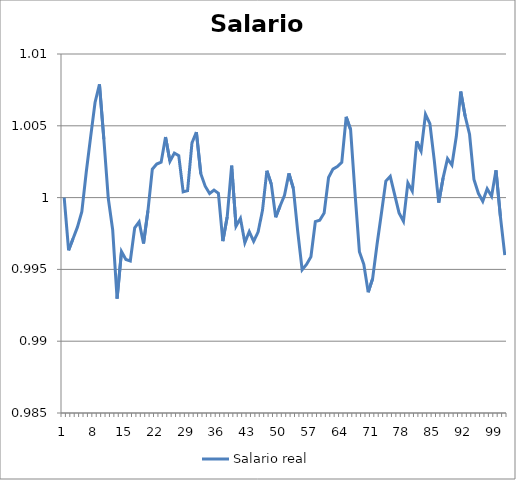
| Category | Salario real |
|---|---|
| 0 | 1 |
| 1 | 0.996 |
| 2 | 0.997 |
| 3 | 0.998 |
| 4 | 0.999 |
| 5 | 1.002 |
| 6 | 1.004 |
| 7 | 1.007 |
| 8 | 1.008 |
| 9 | 1.004 |
| 10 | 1 |
| 11 | 0.998 |
| 12 | 0.993 |
| 13 | 0.996 |
| 14 | 0.996 |
| 15 | 0.996 |
| 16 | 0.998 |
| 17 | 0.998 |
| 18 | 0.997 |
| 19 | 0.999 |
| 20 | 1.002 |
| 21 | 1.002 |
| 22 | 1.002 |
| 23 | 1.004 |
| 24 | 1.003 |
| 25 | 1.003 |
| 26 | 1.003 |
| 27 | 1 |
| 28 | 1 |
| 29 | 1.004 |
| 30 | 1.005 |
| 31 | 1.002 |
| 32 | 1.001 |
| 33 | 1 |
| 34 | 1.001 |
| 35 | 1 |
| 36 | 0.997 |
| 37 | 0.999 |
| 38 | 1.002 |
| 39 | 0.998 |
| 40 | 0.999 |
| 41 | 0.997 |
| 42 | 0.998 |
| 43 | 0.997 |
| 44 | 0.998 |
| 45 | 0.999 |
| 46 | 1.002 |
| 47 | 1.001 |
| 48 | 0.999 |
| 49 | 0.999 |
| 50 | 1 |
| 51 | 1.002 |
| 52 | 1.001 |
| 53 | 0.998 |
| 54 | 0.995 |
| 55 | 0.995 |
| 56 | 0.996 |
| 57 | 0.998 |
| 58 | 0.998 |
| 59 | 0.999 |
| 60 | 1.001 |
| 61 | 1.002 |
| 62 | 1.002 |
| 63 | 1.002 |
| 64 | 1.006 |
| 65 | 1.005 |
| 66 | 1 |
| 67 | 0.996 |
| 68 | 0.995 |
| 69 | 0.993 |
| 70 | 0.994 |
| 71 | 0.997 |
| 72 | 0.999 |
| 73 | 1.001 |
| 74 | 1.001 |
| 75 | 1 |
| 76 | 0.999 |
| 77 | 0.998 |
| 78 | 1.001 |
| 79 | 1 |
| 80 | 1.004 |
| 81 | 1.003 |
| 82 | 1.006 |
| 83 | 1.005 |
| 84 | 1.003 |
| 85 | 1 |
| 86 | 1.001 |
| 87 | 1.003 |
| 88 | 1.002 |
| 89 | 1.004 |
| 90 | 1.007 |
| 91 | 1.006 |
| 92 | 1.004 |
| 93 | 1.001 |
| 94 | 1 |
| 95 | 1 |
| 96 | 1.001 |
| 97 | 1 |
| 98 | 1.002 |
| 99 | 0.999 |
| 100 | 0.996 |